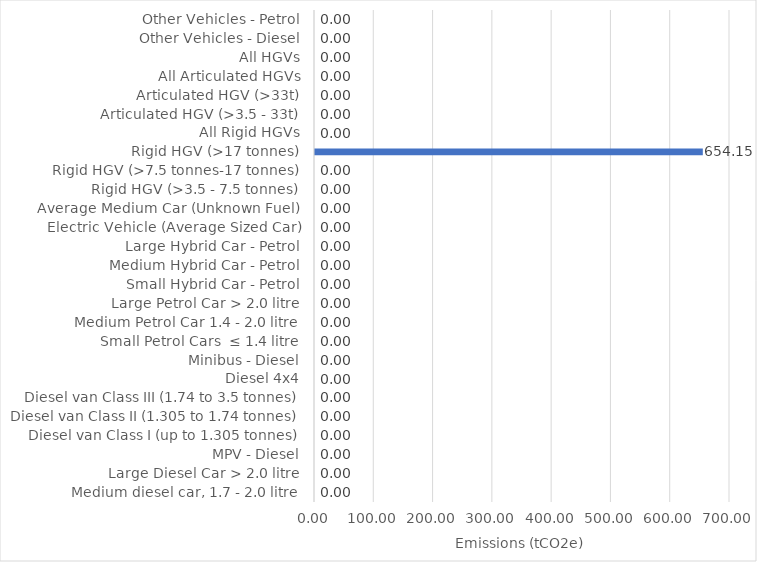
| Category | Emissions
(tCO2e) |
|---|---|
| Medium diesel car, 1.7 - 2.0 litre | 0 |
| Large Diesel Car > 2.0 litre | 0 |
| MPV - Diesel | 0 |
| Diesel van Class I (up to 1.305 tonnes) | 0 |
| Diesel van Class II (1.305 to 1.74 tonnes) | 0 |
| Diesel van Class III (1.74 to 3.5 tonnes) | 0 |
| Diesel 4x4 | 0 |
| Minibus - Diesel | 0 |
| Small Petrol Cars  ≤ 1.4 litre | 0 |
| Medium Petrol Car 1.4 - 2.0 litre | 0 |
| Large Petrol Car > 2.0 litre | 0 |
| Small Hybrid Car - Petrol | 0 |
| Medium Hybrid Car - Petrol | 0 |
| Large Hybrid Car - Petrol | 0 |
| Electric Vehicle (Average Sized Car) | 0 |
| Average Medium Car (Unknown Fuel) | 0 |
| Rigid HGV (>3.5 - 7.5 tonnes) | 0 |
| Rigid HGV (>7.5 tonnes-17 tonnes) | 0 |
| Rigid HGV (>17 tonnes) | 654.154 |
| All Rigid HGVs | 0 |
| Articulated HGV (>3.5 - 33t) | 0 |
| Articulated HGV (>33t) | 0 |
| All Articulated HGVs | 0 |
| All HGVs | 0 |
| Other Vehicles - Diesel | 0 |
| Other Vehicles - Petrol | 0 |